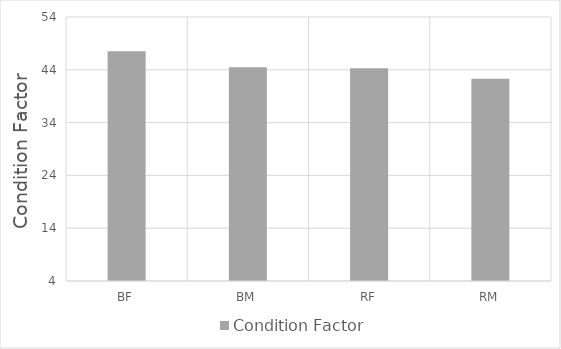
| Category | Condition Factor |
|---|---|
| BF | 47.5 |
| BM | 44.5 |
| RF | 44.3 |
| RM | 42.3 |